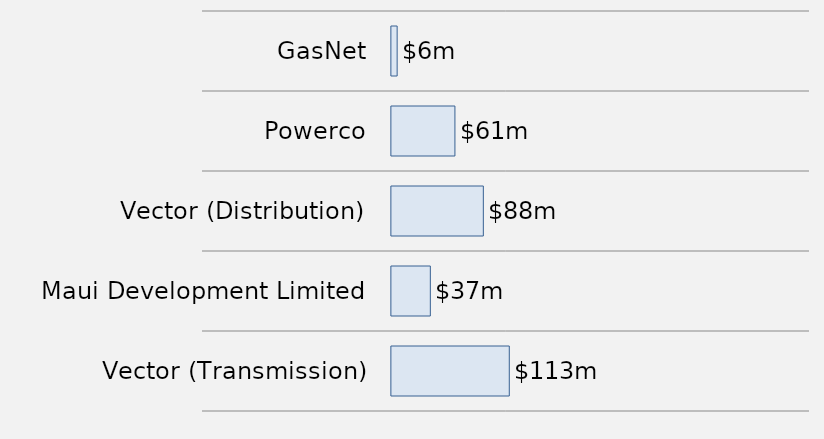
| Category | Series 0 |
|---|---|
| GasNet | 5505.25 |
| Powerco | 60720.975 |
| Vector (Distribution) | 87870.15 |
| Maui Development Limited | 37219.175 |
| Vector (Transmission) | 112659.152 |